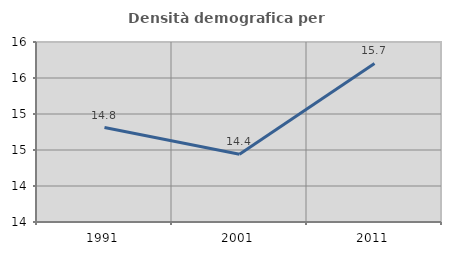
| Category | Densità demografica |
|---|---|
| 1991.0 | 14.812 |
| 2001.0 | 14.44 |
| 2011.0 | 15.703 |